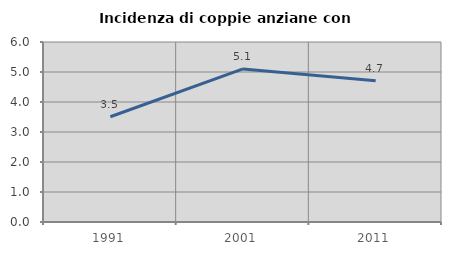
| Category | Incidenza di coppie anziane con figli |
|---|---|
| 1991.0 | 3.509 |
| 2001.0 | 5.102 |
| 2011.0 | 4.706 |